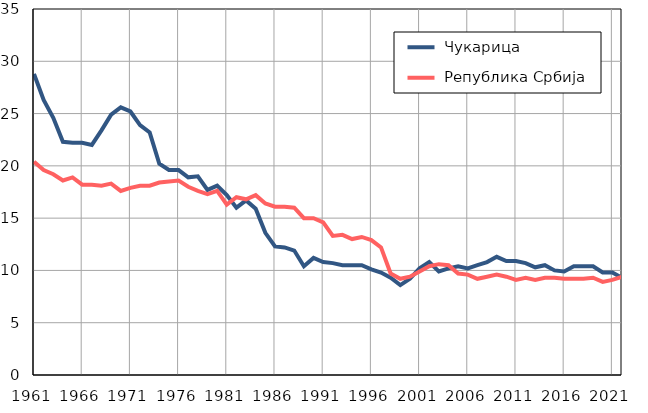
| Category |  Чукарица |  Република Србија |
|---|---|---|
| 1961.0 | 28.8 | 20.4 |
| 1962.0 | 26.3 | 19.6 |
| 1963.0 | 24.6 | 19.2 |
| 1964.0 | 22.3 | 18.6 |
| 1965.0 | 22.2 | 18.9 |
| 1966.0 | 22.2 | 18.2 |
| 1967.0 | 22 | 18.2 |
| 1968.0 | 23.4 | 18.1 |
| 1969.0 | 24.9 | 18.3 |
| 1970.0 | 25.6 | 17.6 |
| 1971.0 | 25.2 | 17.9 |
| 1972.0 | 23.9 | 18.1 |
| 1973.0 | 23.2 | 18.1 |
| 1974.0 | 20.2 | 18.4 |
| 1975.0 | 19.6 | 18.5 |
| 1976.0 | 19.6 | 18.6 |
| 1977.0 | 18.9 | 18 |
| 1978.0 | 19 | 17.6 |
| 1979.0 | 17.7 | 17.3 |
| 1980.0 | 18.1 | 17.6 |
| 1981.0 | 17.2 | 16.3 |
| 1982.0 | 16 | 17 |
| 1983.0 | 16.7 | 16.8 |
| 1984.0 | 15.9 | 17.2 |
| 1985.0 | 13.6 | 16.4 |
| 1986.0 | 12.3 | 16.1 |
| 1987.0 | 12.2 | 16.1 |
| 1988.0 | 11.9 | 16 |
| 1989.0 | 10.4 | 15 |
| 1990.0 | 11.2 | 15 |
| 1991.0 | 10.8 | 14.6 |
| 1992.0 | 10.7 | 13.3 |
| 1993.0 | 10.5 | 13.4 |
| 1994.0 | 10.5 | 13 |
| 1995.0 | 10.5 | 13.2 |
| 1996.0 | 10.1 | 12.9 |
| 1997.0 | 9.8 | 12.2 |
| 1998.0 | 9.3 | 9.7 |
| 1999.0 | 8.6 | 9.2 |
| 2000.0 | 9.2 | 9.4 |
| 2001.0 | 10.2 | 9.9 |
| 2002.0 | 10.8 | 10.4 |
| 2003.0 | 9.9 | 10.6 |
| 2004.0 | 10.2 | 10.5 |
| 2005.0 | 10.4 | 9.7 |
| 2006.0 | 10.2 | 9.6 |
| 2007.0 | 10.5 | 9.2 |
| 2008.0 | 10.8 | 9.4 |
| 2009.0 | 11.3 | 9.6 |
| 2010.0 | 10.9 | 9.4 |
| 2011.0 | 10.9 | 9.1 |
| 2012.0 | 10.7 | 9.3 |
| 2013.0 | 10.3 | 9.1 |
| 2014.0 | 10.5 | 9.3 |
| 2015.0 | 10 | 9.3 |
| 2016.0 | 9.9 | 9.2 |
| 2017.0 | 10.4 | 9.2 |
| 2018.0 | 10.4 | 9.2 |
| 2019.0 | 10.4 | 9.3 |
| 2020.0 | 9.8 | 8.9 |
| 2021.0 | 9.8 | 9.1 |
| 2022.0 | 9.3 | 9.4 |